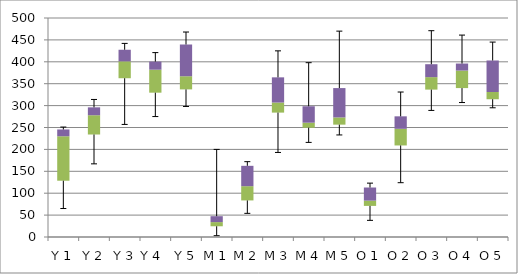
| Category | Min | Q1-Min | Med-Q1 | Q3-Med |
|---|---|---|---|---|
| Y 1 | 65 | 63.5 | 101.5 | 15.5 |
| Y 2 | 167 | 67 | 44 | 18 |
| Y 3 | 257 | 105.5 | 38.5 | 26.5 |
| Y 4  | 275 | 54.5 | 52.5 | 18.5 |
| Y 5 | 298 | 39 | 30 | 72.5 |
| M 1 | 3 | 21.5 | 9.5 | 13.5 |
| M 2 | 54 | 29.5 | 32.5 | 46.5 |
| M 3 | 193 | 91 | 23 | 57.5 |
| M 4  | 216 | 33.5 | 11.5 | 37.5 |
| M 5 | 233 | 23.5 | 16.5 | 67 |
| O 1 | 38 | 33 | 12 | 30 |
| O 2 | 124 | 85 | 38 | 28.5 |
| O 3 | 289 | 47.5 | 28.5 | 29.5 |
| O 4  | 307 | 33 | 40 | 16 |
| O 5 | 295 | 19.5 | 16.5 | 72 |